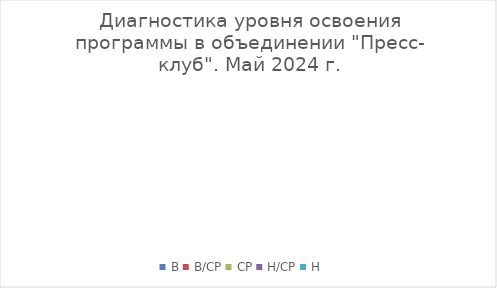
| Category | Series 0 |
|---|---|
| В | 0 |
| В/СР | 0 |
| СР | 0 |
| Н/СР | 0 |
| Н | 0 |